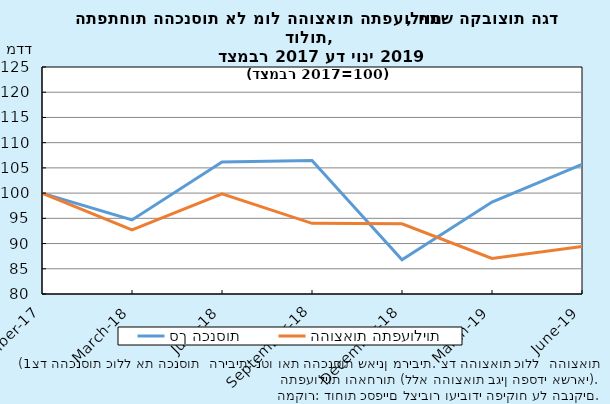
| Category | סך הכנסות | ההוצאות התפעוליות |
|---|---|---|
| 2017-12-31 | 100 | 100 |
| 2018-03-31 | 94.681 | 92.713 |
| 2018-06-30 | 106.189 | 99.851 |
| 2018-09-30 | 106.471 | 94.004 |
| 2018-12-31 | 86.784 | 93.917 |
| 2019-03-31 | 98.219 | 87.052 |
| 2019-06-30 | 105.676 | 89.398 |